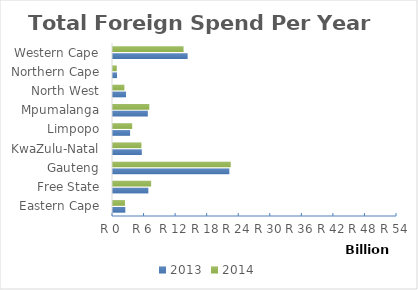
| Category | 2013 | 2014 |
|---|---|---|
| Eastern Cape | 2342508263.4 | 2275290576.16 |
| Free State | 6720961375.6 | 7251470145.25 |
| Gauteng | 22121067447.41 | 22384113180.6 |
| KwaZulu-Natal | 5475585495.94 | 5407886365.8 |
| Limpopo | 3250048095.83 | 3648684584.41 |
| Mpumalanga | 6623089602.25 | 6903739097.61 |
| North West | 2472093394.74 | 2165089846.8 |
| Northern Cape | 759818271.55 | 720568716.55 |
| Western Cape | 14189585512.25 | 13414221046.89 |